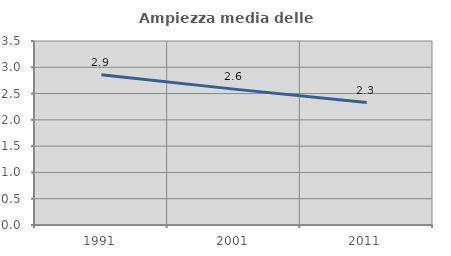
| Category | Ampiezza media delle famiglie |
|---|---|
| 1991.0 | 2.86 |
| 2001.0 | 2.585 |
| 2011.0 | 2.33 |